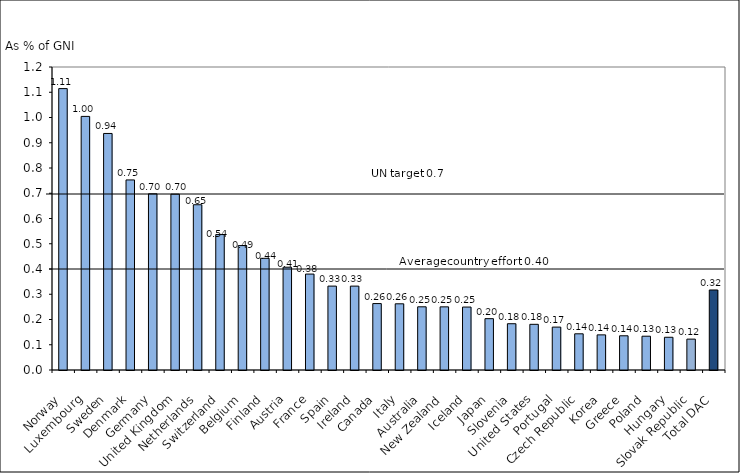
| Category | Series 0 |
|---|---|
| Norway | 1.114 |
| Luxembourg | 1.004 |
| Sweden | 0.937 |
| Denmark | 0.753 |
| Germany | 0.698 |
| United Kingdom | 0.696 |
| Netherlands | 0.654 |
| Switzerland | 0.536 |
| Belgium | 0.493 |
| Finland | 0.442 |
| Austria | 0.407 |
| France | 0.38 |
| Spain | 0.332 |
| Ireland | 0.332 |
| Canada | 0.263 |
| Italy | 0.262 |
| Australia | 0.25 |
| New Zealand | 0.25 |
| Iceland | 0.249 |
| Japan | 0.203 |
| Slovenia | 0.183 |
| United States | 0.181 |
| Portugal | 0.17 |
| Czech Republic | 0.143 |
| Korea | 0.139 |
| Greece | 0.136 |
| Poland | 0.134 |
| Hungary | 0.13 |
| Slovak Republic | 0.122 |
| Total DAC | 0.317 |